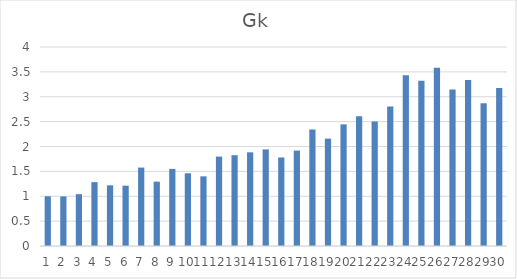
| Category | Gk |
|---|---|
| 0 | 1 |
| 1 | 0.997 |
| 2 | 1.042 |
| 3 | 1.283 |
| 4 | 1.219 |
| 5 | 1.212 |
| 6 | 1.576 |
| 7 | 1.293 |
| 8 | 1.55 |
| 9 | 1.462 |
| 10 | 1.4 |
| 11 | 1.797 |
| 12 | 1.825 |
| 13 | 1.883 |
| 14 | 1.941 |
| 15 | 1.78 |
| 16 | 1.918 |
| 17 | 2.342 |
| 18 | 2.158 |
| 19 | 2.445 |
| 20 | 2.61 |
| 21 | 2.503 |
| 22 | 2.804 |
| 23 | 3.433 |
| 24 | 3.32 |
| 25 | 3.58 |
| 26 | 3.145 |
| 27 | 3.335 |
| 28 | 2.872 |
| 29 | 3.175 |